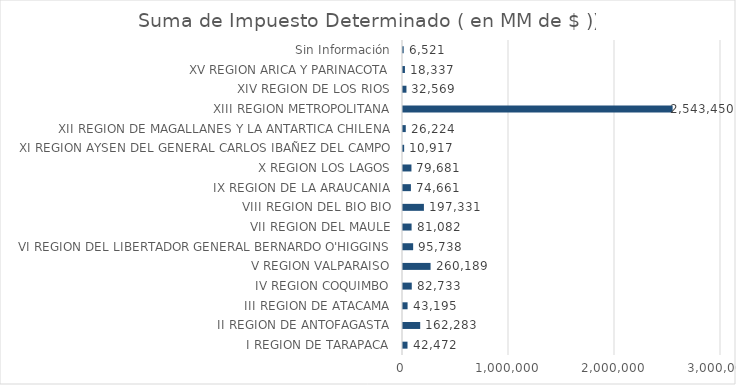
| Category | Series 0 |
|---|---|
|    I REGION DE TARAPACA | 42472.1 |
|   II REGION DE ANTOFAGASTA | 162283.1 |
|  III REGION DE ATACAMA | 43194.8 |
|   IV REGION COQUIMBO | 82733.1 |
|    V REGION VALPARAISO | 260188.8 |
|   VI REGION DEL LIBERTADOR GENERAL BERNARDO O'HIGGINS | 95738.1 |
|  VII REGION DEL MAULE | 81081.7 |
| VIII REGION DEL BIO BIO | 197330.7 |
|   IX REGION DE LA ARAUCANIA | 74660.8 |
|    X REGION LOS LAGOS | 79680.6 |
|   XI REGION AYSEN DEL GENERAL CARLOS IBAÑEZ DEL CAMPO | 10916.5 |
|  XII REGION DE MAGALLANES Y LA ANTARTICA CHILENA | 26223.5 |
| XIII REGION METROPOLITANA | 2543449.5 |
|  XIV REGION DE LOS RIOS | 32568.8 |
|   XV REGION ARICA Y PARINACOTA | 18337.1 |
| Sin Información | 6521 |